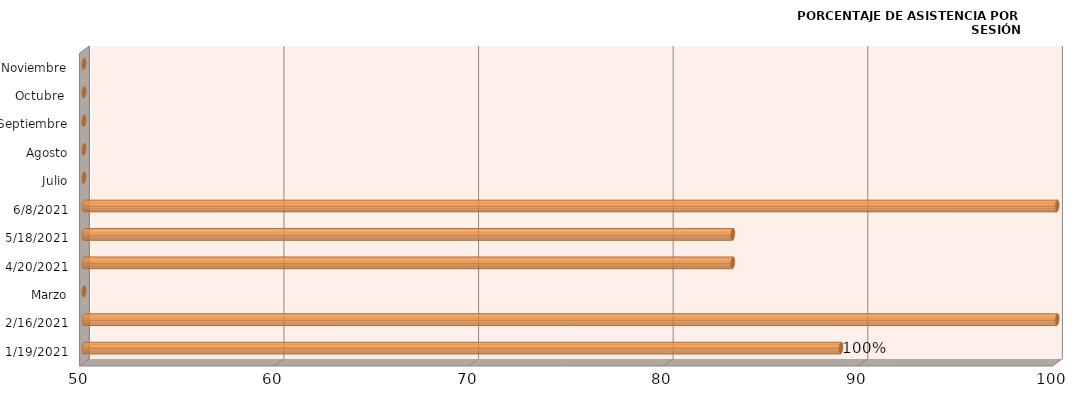
| Category | Series 0 |
|---|---|
| 19/01/2021 | 88.889 |
| 16/02/2021 | 100 |
| Marzo | 0 |
| 20/04/2021 | 83.333 |
| 18/05/2021 | 83.333 |
| 08/06/2021 | 100 |
| Julio | 0 |
| Agosto | 0 |
| Septiembre | 0 |
| Octubre  | 0 |
| Noviembre | 0 |